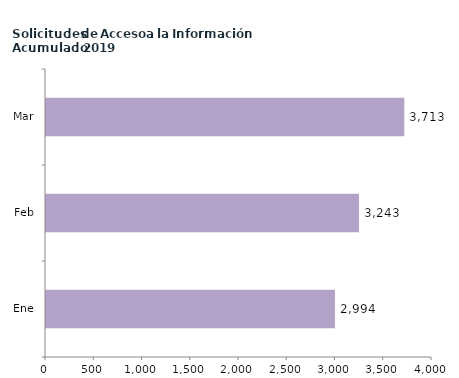
| Category | Series 0 |
|---|---|
| Ene | 2994 |
| Feb | 3243 |
| Mar | 3713 |